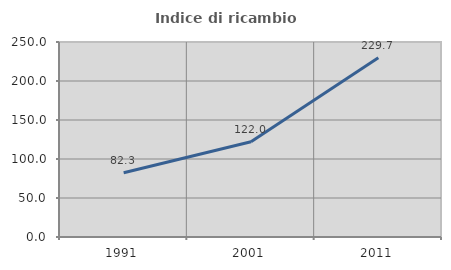
| Category | Indice di ricambio occupazionale  |
|---|---|
| 1991.0 | 82.315 |
| 2001.0 | 122.041 |
| 2011.0 | 229.703 |